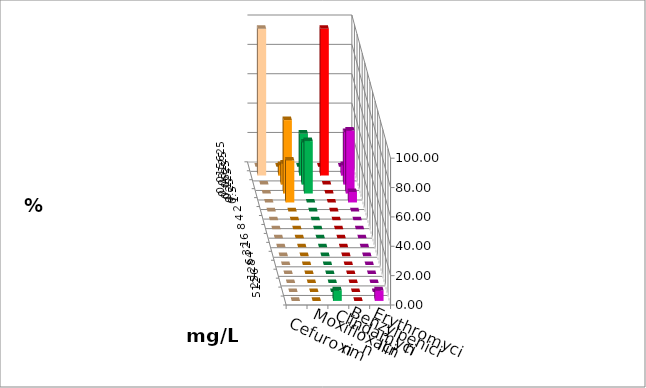
| Category | Cefuroxim | Moxifloxacin | Clindamycin | Benzylpenicillin | Erythromycin |
|---|---|---|---|---|---|
| 0.015625 | 0 | 0 | 0 | 0 | 0 |
| 0.03125 | 100 | 7.143 | 28.571 | 100 | 7.143 |
| 0.0625 | 0 | 14.286 | 28.571 | 0 | 35.714 |
| 0.125 | 0 | 50 | 35.714 | 0 | 42.857 |
| 0.25 | 0 | 28.571 | 0 | 0 | 7.143 |
| 0.5 | 0 | 0 | 0 | 0 | 0 |
| 1.0 | 0 | 0 | 0 | 0 | 0 |
| 2.0 | 0 | 0 | 0 | 0 | 0 |
| 4.0 | 0 | 0 | 0 | 0 | 0 |
| 8.0 | 0 | 0 | 0 | 0 | 0 |
| 16.0 | 0 | 0 | 0 | 0 | 0 |
| 32.0 | 0 | 0 | 0 | 0 | 0 |
| 64.0 | 0 | 0 | 0 | 0 | 0 |
| 128.0 | 0 | 0 | 0 | 0 | 0 |
| 256.0 | 0 | 0 | 0 | 0 | 0 |
| 512.0 | 0 | 0 | 7.143 | 0 | 7.143 |